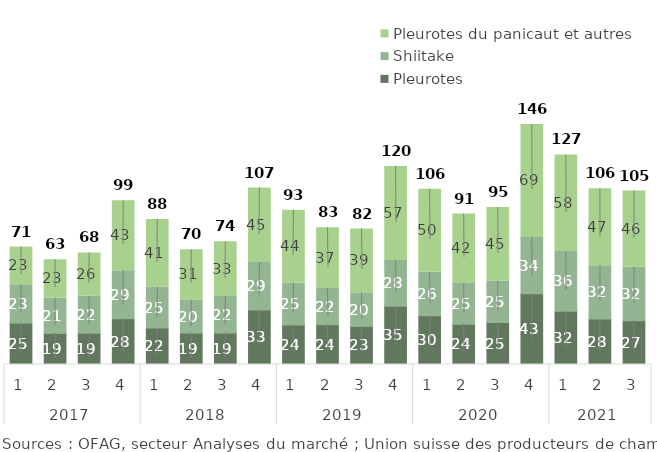
| Category | Pleurotes | Shiitake | Pleurotes du panicaut et autres |
|---|---|---|---|
| 0 | 25.079 | 23.265 | 22.819 |
| 1 | 18.886 | 21.334 | 23.258 |
| 2 | 18.971 | 22.42 | 26.243 |
| 3 | 27.754 | 29.034 | 42.505 |
| 4 | 22.146 | 24.677 | 41.005 |
| 5 | 19.059 | 19.94 | 30.556 |
| 6 | 19.065 | 22.163 | 33.138 |
| 7 | 33.082 | 28.698 | 45.186 |
| 8 | 24.008 | 25.417 | 44.031 |
| 9 | 24.127 | 22.004 | 36.701 |
| 10 | 23.106 | 20.279 | 38.721 |
| 11 | 35.378 | 27.707 | 56.989 |
| 12 | 29.53 | 26.447 | 50.171 |
| 13 | 24.449 | 24.65 | 42.046 |
| 14 | 25.404 | 25.13 | 44.589 |
| 15 | 42.867 | 34.053 | 68.586 |
| 16 | 32.347 | 36.183 | 58.472 |
| 17 | 27.565 | 32.275 | 46.621 |
| 18 | 26.576 | 32.478 | 46.072 |